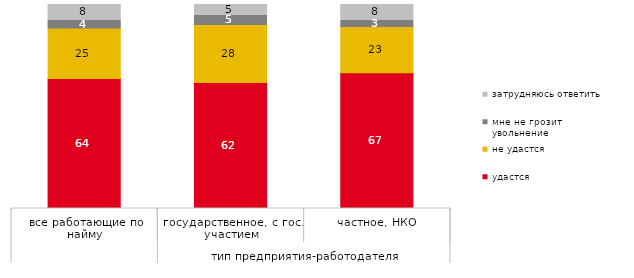
| Category | удастся | не удастся | мне не грозит увольнение | затрудняюсь ответить |
|---|---|---|---|---|
| 0 | 63.722 | 24.711 | 3.996 | 7.571 |
| 1 | 61.757 | 28.424 | 4.651 | 5.168 |
| 2 | 66.603 | 22.581 | 3.226 | 7.59 |